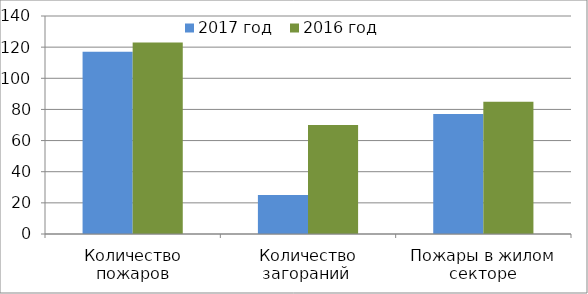
| Category | 2017 год | 2016 год |
|---|---|---|
| Количество пожаров | 117 | 123 |
| Количество загораний  | 25 | 70 |
| Пожары в жилом секторе | 77 | 85 |